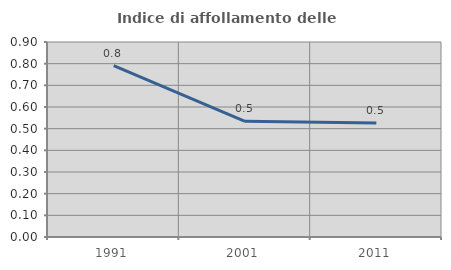
| Category | Indice di affollamento delle abitazioni  |
|---|---|
| 1991.0 | 0.791 |
| 2001.0 | 0.534 |
| 2011.0 | 0.526 |